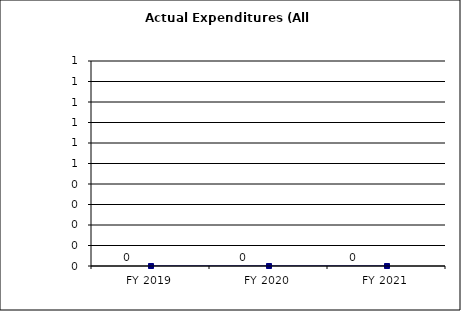
| Category | Actual Expenditures (All Funds) |
|---|---|
| FY 2019 | 0 |
| FY 2020 | 0 |
| FY 2021 | 0 |